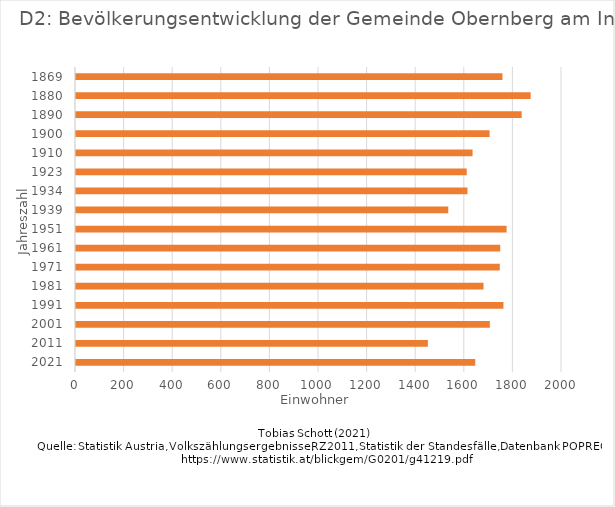
| Category | Einwohner |
|---|---|
| 2021.0 | 1643 |
| 2011.0 | 1448 |
| 2001.0 | 1703 |
| 1991.0 | 1759 |
| 1981.0 | 1677 |
| 1971.0 | 1744 |
| 1961.0 | 1746 |
| 1951.0 | 1772 |
| 1939.0 | 1532 |
| 1934.0 | 1611 |
| 1923.0 | 1608 |
| 1910.0 | 1632 |
| 1900.0 | 1702 |
| 1890.0 | 1834 |
| 1880.0 | 1871 |
| 1869.0 | 1755 |